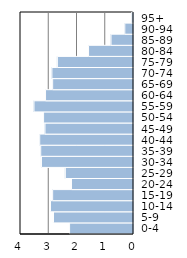
| Category | Series 0 |
|---|---|
| 0-4 | 2.263 |
| 5-9 | 2.832 |
| 10-14 | 2.937 |
| 15-19 | 2.862 |
| 20-24 | 2.194 |
| 25-29 | 2.413 |
| 30-34 | 3.258 |
| 35-39 | 3.284 |
| 40-44 | 3.32 |
| 45-49 | 3.133 |
| 50-54 | 3.183 |
| 55-59 | 3.523 |
| 60-64 | 3.114 |
| 65-69 | 2.862 |
| 70-74 | 2.888 |
| 75-79 | 2.695 |
| 80-84 | 1.591 |
| 85-89 | 0.796 |
| 90-94 | 0.308 |
| 95+ | 0.059 |